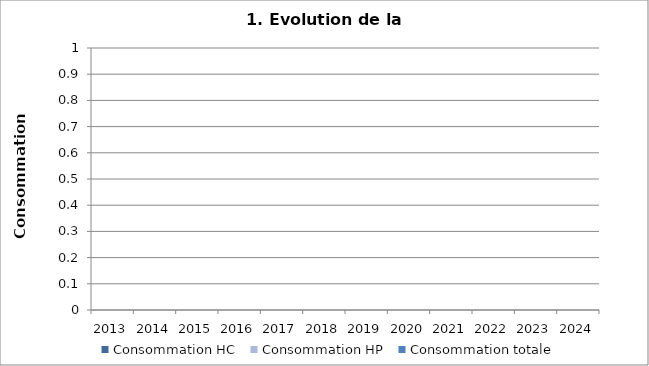
| Category | Consommation HC | Consommation HP | Consommation totale |
|---|---|---|---|
| 2013.0 |  |  | 0 |
| 2014.0 |  |  | 0 |
| 2015.0 |  |  | 0 |
| 2016.0 |  |  | 0 |
| 2017.0 |  |  | 0 |
| 2018.0 |  |  | 0 |
| 2019.0 |  |  | 0 |
| 2020.0 |  |  | 0 |
| 2021.0 |  |  | 0 |
| 2022.0 |  |  | 0 |
| 2023.0 |  |  | 0 |
| 2024.0 |  |  | 0 |